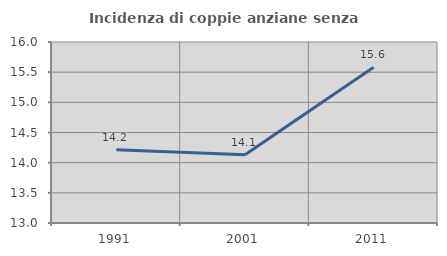
| Category | Incidenza di coppie anziane senza figli  |
|---|---|
| 1991.0 | 14.214 |
| 2001.0 | 14.132 |
| 2011.0 | 15.582 |